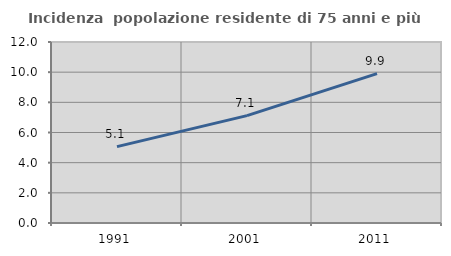
| Category | Incidenza  popolazione residente di 75 anni e più |
|---|---|
| 1991.0 | 5.063 |
| 2001.0 | 7.119 |
| 2011.0 | 9.901 |